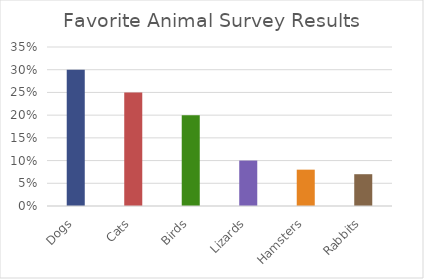
| Category | Favorite Animal |
|---|---|
| Dogs | 0.3 |
| Cats | 0.25 |
| Birds | 0.2 |
| Lizards | 0.1 |
| Hamsters | 0.08 |
| Rabbits | 0.07 |